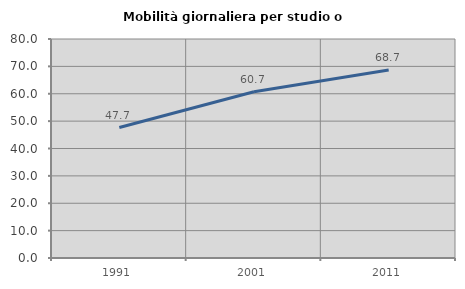
| Category | Mobilità giornaliera per studio o lavoro |
|---|---|
| 1991.0 | 47.66 |
| 2001.0 | 60.728 |
| 2011.0 | 68.704 |